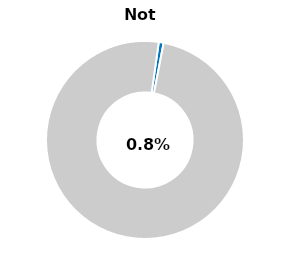
| Category | Series 0 |
|---|---|
| Not passed | 0.008 |
| Other | 0.992 |